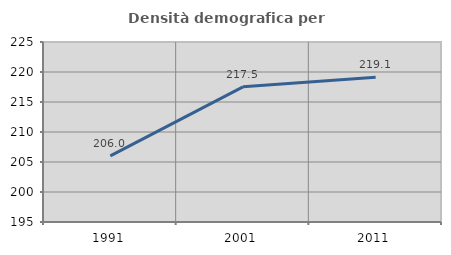
| Category | Densità demografica |
|---|---|
| 1991.0 | 206.014 |
| 2001.0 | 217.523 |
| 2011.0 | 219.118 |